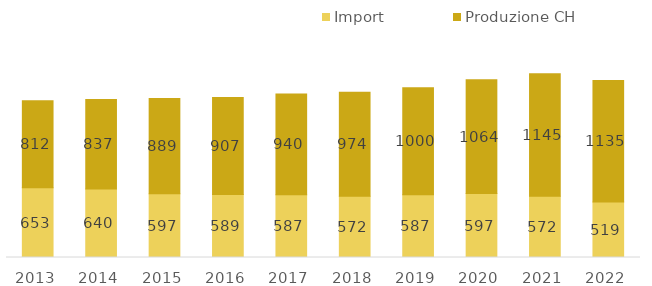
| Category | Import | Produzione CH  |
|---|---|---|
| 2013.0 | 652.768 | 812.19 |
| 2014.0 | 640.158 | 837.131 |
| 2015.0 | 596.708 | 888.838 |
| 2016.0 | 589.14 | 906.608 |
| 2017.0 | 587.087 | 940.169 |
| 2018.0 | 571.531 | 973.558 |
| 2019.0 | 587.082 | 1000.351 |
| 2020.0 | 596.979 | 1063.733 |
| 2021.0 | 572.065 | 1145.384 |
| 2022.0 | 519.287 | 1134.735 |